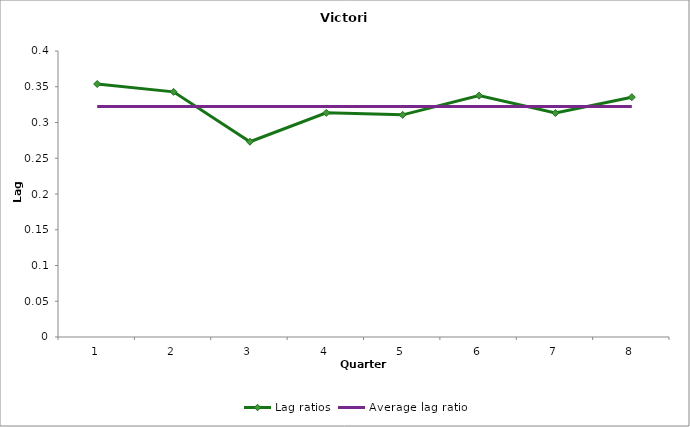
| Category | Lag ratios | Average lag ratio |
|---|---|---|
| 0 | 0.354 | 0.323 |
| 1 | 0.343 | 0.323 |
| 2 | 0.273 | 0.323 |
| 3 | 0.314 | 0.323 |
| 4 | 0.311 | 0.323 |
| 5 | 0.338 | 0.323 |
| 6 | 0.313 | 0.323 |
| 7 | 0.335 | 0.323 |